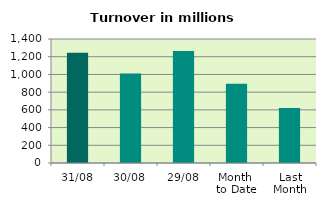
| Category | Series 0 |
|---|---|
| 31/08 | 1243.837 |
| 30/08 | 1010.35 |
| 29/08 | 1264.614 |
| Month 
to Date | 893.956 |
| Last
Month | 622.259 |